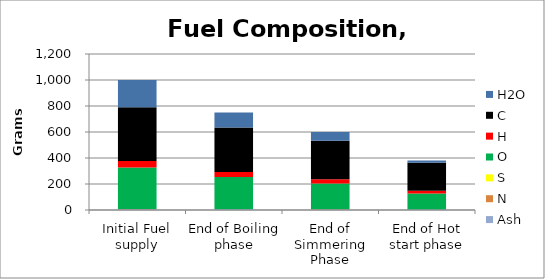
| Category | Ash | N | S | O | H | C | H2O |
|---|---|---|---|---|---|---|---|
| Initial Fuel supply | 6.32 | 0.79 | 0 | 319.95 | 49.77 | 413.17 | 210 |
| End of Boiling phase | 5.133 | 0.747 | 0 | 247.082 | 38.958 | 342.24 | 115.84 |
| End of Simmering Phase | 4.368 | 0.725 | 0 | 199.474 | 31.914 | 296.8 | 66.72 |
| End of Hot start phase | 3.064 | 0.647 | 0 | 123.14 | 20.461 | 216.938 | 15.75 |